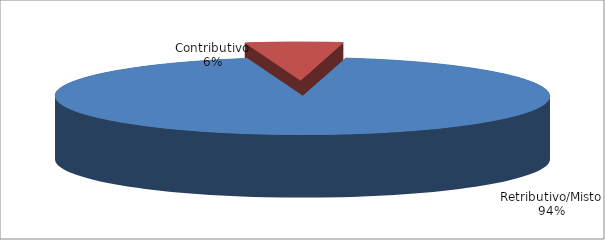
| Category | Series 1 |
|---|---|
| Retributivo/Misto | 53191 |
| Contributivo | 3618 |